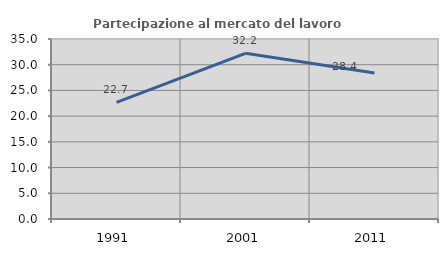
| Category | Partecipazione al mercato del lavoro  femminile |
|---|---|
| 1991.0 | 22.676 |
| 2001.0 | 32.214 |
| 2011.0 | 28.38 |